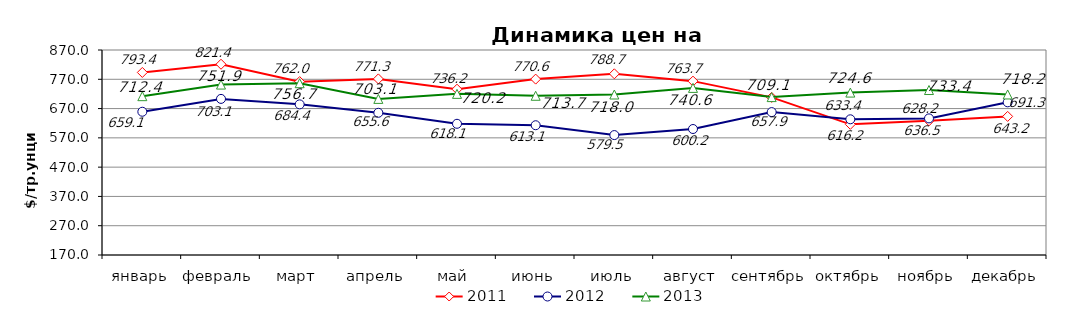
| Category | 2011 | 2012 | 2013 |
|---|---|---|---|
| январь | 793.35 | 659.14 | 712.36 |
| февраль | 821.35 | 703.05 | 751.93 |
| март | 762 | 684.36 | 756.65 |
| апрель | 771.31 | 655.58 | 703.05 |
| май | 736.15 | 618.05 | 720.19 |
| июнь | 770.57 | 613.11 | 713.68 |
| июль | 788.74 | 579.5 | 718.02 |
| август | 763.7 | 600.2 | 740.57 |
| сентябрь | 708.17 | 657.9 | 709.14 |
| октябрь | 616.219 | 633.37 | 724.61 |
| ноябрь | 628.23 | 636.5 | 733.36 |
| декабрь | 643.2 | 691.32 | 718.2 |